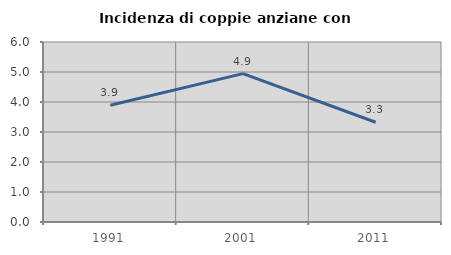
| Category | Incidenza di coppie anziane con figli |
|---|---|
| 1991.0 | 3.889 |
| 2001.0 | 4.945 |
| 2011.0 | 3.325 |